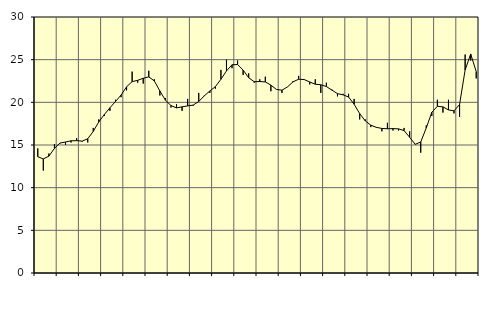
| Category | Piggar | Series 1 |
|---|---|---|
| nan | 14.6 | 13.63 |
| 1.0 | 12 | 13.37 |
| 1.0 | 14 | 13.69 |
| 1.0 | 15.1 | 14.6 |
| nan | 15.2 | 15.23 |
| 2.0 | 15 | 15.35 |
| 2.0 | 15.3 | 15.49 |
| 2.0 | 15.8 | 15.51 |
| nan | 15.4 | 15.45 |
| 3.0 | 15.3 | 15.73 |
| 3.0 | 17 | 16.6 |
| 3.0 | 18 | 17.71 |
| nan | 18.4 | 18.58 |
| 4.0 | 19 | 19.36 |
| 4.0 | 20.3 | 20.1 |
| 4.0 | 20.6 | 20.84 |
| nan | 21.4 | 21.82 |
| 5.0 | 23.6 | 22.42 |
| 5.0 | 22.3 | 22.58 |
| 5.0 | 22.2 | 22.82 |
| nan | 23.7 | 22.98 |
| 6.0 | 22.7 | 22.51 |
| 6.0 | 20.8 | 21.33 |
| 6.0 | 20.5 | 20.25 |
| nan | 19.4 | 19.62 |
| 7.0 | 19.8 | 19.35 |
| 7.0 | 19 | 19.47 |
| 7.0 | 20.4 | 19.58 |
| nan | 19.6 | 19.68 |
| 8.0 | 21.1 | 20.09 |
| 8.0 | 20.8 | 20.76 |
| 8.0 | 21.1 | 21.33 |
| nan | 21.6 | 21.84 |
| 9.0 | 23.8 | 22.7 |
| 9.0 | 25 | 23.68 |
| 9.0 | 24 | 24.4 |
| nan | 24.9 | 24.43 |
| 10.0 | 23.2 | 23.78 |
| 10.0 | 23.4 | 22.88 |
| 10.0 | 22.3 | 22.42 |
| nan | 22.7 | 22.44 |
| 11.0 | 23 | 22.39 |
| 11.0 | 21.3 | 22.02 |
| 11.0 | 21.5 | 21.51 |
| nan | 21.1 | 21.42 |
| 12.0 | 21.8 | 21.81 |
| 12.0 | 22.5 | 22.4 |
| 12.0 | 23.1 | 22.71 |
| nan | 22.7 | 22.67 |
| 13.0 | 22.1 | 22.39 |
| 13.0 | 22.7 | 22.12 |
| 13.0 | 21.1 | 22.06 |
| nan | 22.3 | 21.85 |
| 14.0 | 21.5 | 21.43 |
| 14.0 | 20.7 | 21.02 |
| 14.0 | 21 | 20.88 |
| nan | 21 | 20.62 |
| 15.0 | 20.4 | 19.77 |
| 15.0 | 18 | 18.68 |
| 15.0 | 18 | 17.83 |
| nan | 17.1 | 17.33 |
| 16.0 | 17.1 | 17.07 |
| 16.0 | 16.6 | 16.94 |
| 16.0 | 17.6 | 16.9 |
| nan | 16.7 | 16.92 |
| 17.0 | 16.7 | 16.89 |
| 17.0 | 17 | 16.69 |
| 17.0 | 16.6 | 15.91 |
| nan | 15.1 | 15.08 |
| 18.0 | 14.1 | 15.35 |
| 18.0 | 17.3 | 17 |
| 18.0 | 18.4 | 18.83 |
| nan | 20.3 | 19.54 |
| 19.0 | 18.8 | 19.47 |
| 19.0 | 20.3 | 19.11 |
| 19.0 | 18.7 | 19 |
| nan | 18.3 | 19.75 |
| 20.0 | 25.6 | 23.79 |
| 20.0 | 24.9 | 25.67 |
| 20.0 | 22.8 | 23.59 |